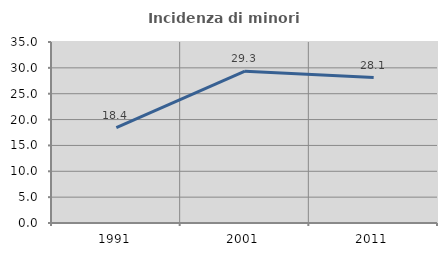
| Category | Incidenza di minori stranieri |
|---|---|
| 1991.0 | 18.421 |
| 2001.0 | 29.348 |
| 2011.0 | 28.133 |